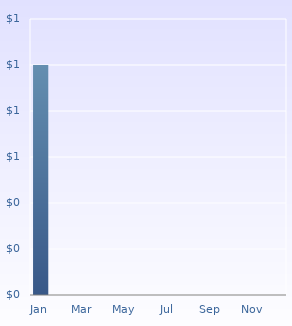
| Category | Expense |
|---|---|
| Jan | 1 |
| Feb | 0 |
| Mar | 0 |
| Apr | 0 |
| May | 0 |
| Jun | 0 |
| Jul | 0 |
| Aug | 0 |
| Sep | 0 |
| Oct | 0 |
| Nov | 0 |
| Dec | 0 |